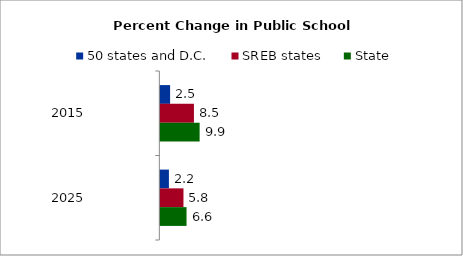
| Category | 50 states and D.C. | SREB states | State |
|---|---|---|---|
| 2015.0 | 2.471 | 8.494 | 9.933 |
| 2025.0 | 2.171 | 5.849 | 6.622 |